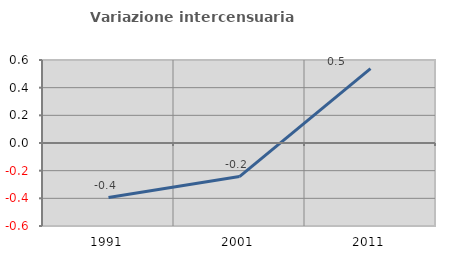
| Category | Variazione intercensuaria annua |
|---|---|
| 1991.0 | -0.394 |
| 2001.0 | -0.243 |
| 2011.0 | 0.538 |